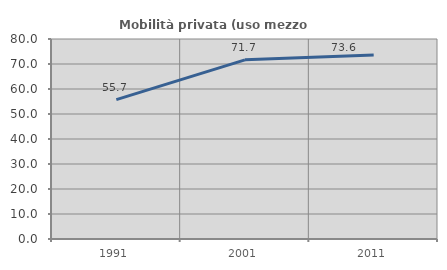
| Category | Mobilità privata (uso mezzo privato) |
|---|---|
| 1991.0 | 55.743 |
| 2001.0 | 71.662 |
| 2011.0 | 73.605 |